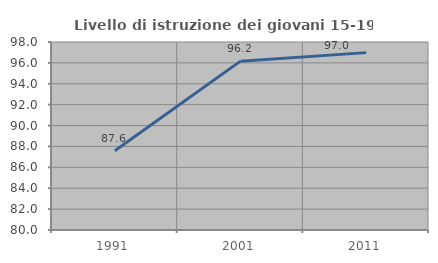
| Category | Livello di istruzione dei giovani 15-19 anni |
|---|---|
| 1991.0 | 87.58 |
| 2001.0 | 96.167 |
| 2011.0 | 96.983 |